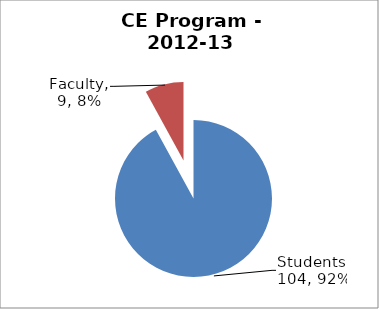
| Category | Series 0 |
|---|---|
| Students | 104 |
| Faculty | 9 |